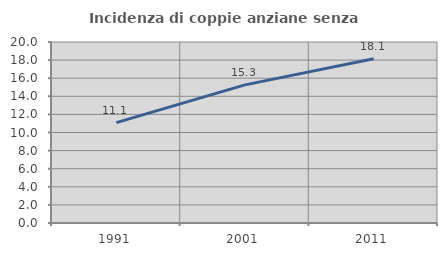
| Category | Incidenza di coppie anziane senza figli  |
|---|---|
| 1991.0 | 11.096 |
| 2001.0 | 15.261 |
| 2011.0 | 18.147 |